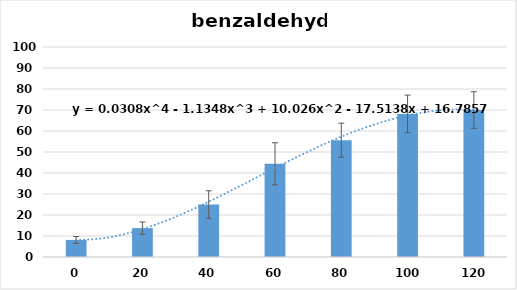
| Category | Series 0 |
|---|---|
| 0.0 | 8.125 |
| 20.0 | 13.75 |
| 40.0 | 25 |
| 60.0 | 44.375 |
| 80.0 | 55.625 |
| 100.0 | 68.125 |
| 120.0 | 70 |